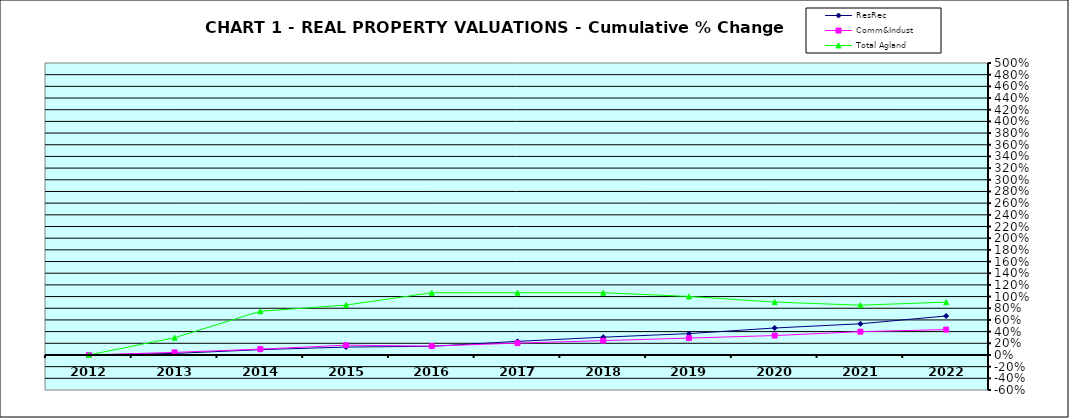
| Category | ResRec | Comm&Indust | Total Agland |
|---|---|---|---|
| 2012.0 | 0 | 0 | 0 |
| 2013.0 | 0.027 | 0.044 | 0.296 |
| 2014.0 | 0.091 | 0.1 | 0.748 |
| 2015.0 | 0.135 | 0.168 | 0.854 |
| 2016.0 | 0.149 | 0.152 | 1.066 |
| 2017.0 | 0.233 | 0.203 | 1.066 |
| 2018.0 | 0.304 | 0.246 | 1.066 |
| 2019.0 | 0.366 | 0.289 | 1.002 |
| 2020.0 | 0.462 | 0.332 | 0.906 |
| 2021.0 | 0.534 | 0.399 | 0.852 |
| 2022.0 | 0.668 | 0.434 | 0.905 |